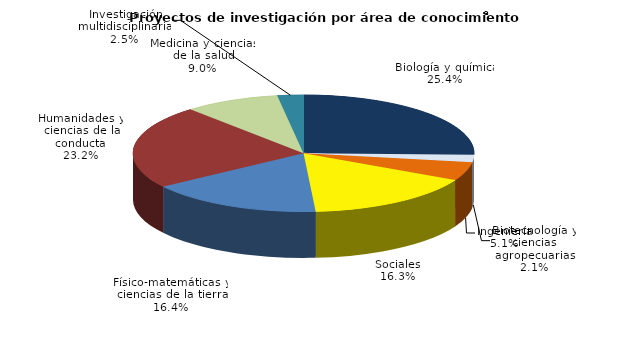
| Category | Series 0 |
|---|---|
| Biología y química | 0.254 |
| Biotecnología y ciencias agropecuarias | 0.021 |
| Ingeniería | 0.051 |
| Sociales | 0.163 |
| Físico-matemáticas y ciencias de la tierra | 0.164 |
| Humanidades y ciencias de la conducta | 0.232 |
| Medicina y ciencias de la salud | 0.09 |
| Investigación multidisciplinaria | 0.025 |